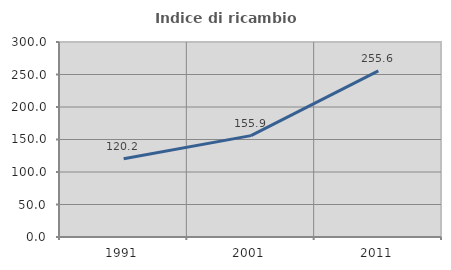
| Category | Indice di ricambio occupazionale  |
|---|---|
| 1991.0 | 120.245 |
| 2001.0 | 155.944 |
| 2011.0 | 255.556 |